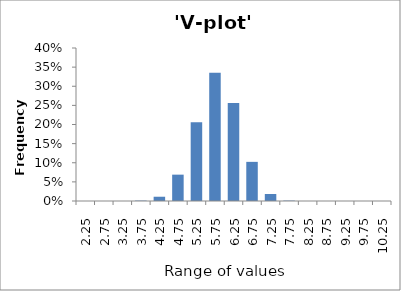
| Category | 'V-plot' sample |
|---|---|
| 2.25 | 0 |
| 2.75 | 0 |
| 3.25 | 0 |
| 3.75 | 0.001 |
| 4.25 | 0.011 |
| 4.75 | 0.069 |
| 5.25 | 0.206 |
| 5.75 | 0.335 |
| 6.25 | 0.256 |
| 6.75 | 0.102 |
| 7.25 | 0.018 |
| 7.75 | 0.001 |
| 8.25 | 0 |
| 8.75 | 0 |
| 9.25 | 0 |
| 9.75 | 0 |
| 10.25 | 0 |